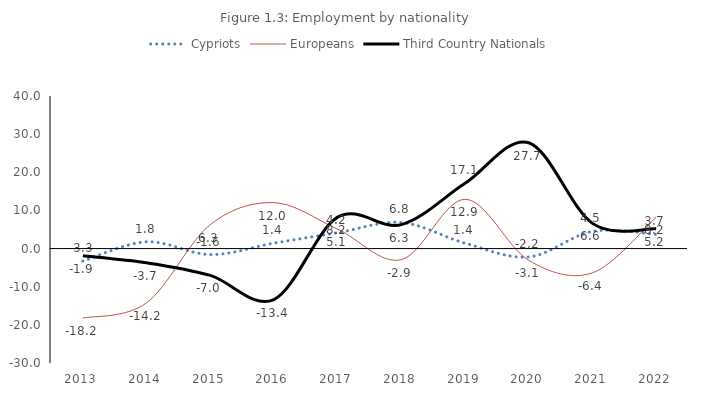
| Category | Cypriots | Europeans | Third Country Nationals |
|---|---|---|---|
| 2013.0 | -3.29 | -18.222 | -1.88 |
| 2014.0 | 1.775 | -14.237 | -3.719 |
| 2015.0 | -1.572 | 6.259 | -7.033 |
| 2016.0 | 1.417 | 12.032 | -13.366 |
| 2017.0 | 4.157 | 5.075 | 8.24 |
| 2018.0 | 6.843 | -2.918 | 6.279 |
| 2019.0 | 1.42 | 12.921 | 17.102 |
| 2020.0 | -2.196 | -3.089 | 27.743 |
| 2021.0 | 4.512 | -6.373 | 6.604 |
| 2022.0 | 3.715 | 8.185 | 5.199 |